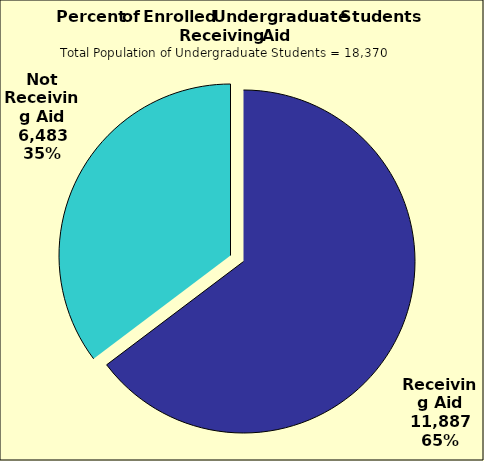
| Category | Series 0 |
|---|---|
| Receiving Aid | 11887 |
| Not Receiving Aid | 6483 |